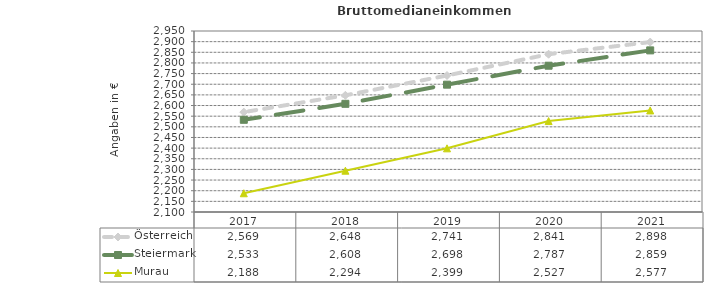
| Category | Österreich | Steiermark | Murau |
|---|---|---|---|
| 2021.0 | 2898 | 2859 | 2577 |
| 2020.0 | 2841 | 2787 | 2527 |
| 2019.0 | 2741 | 2698 | 2399 |
| 2018.0 | 2648 | 2608 | 2294 |
| 2017.0 | 2569 | 2533 | 2188 |